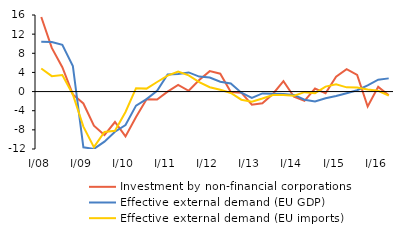
| Category | Investment by non-financial corporations | Effective external demand (EU GDP) | Effective external demand (EU imports) |
|---|---|---|---|
| I/08 | 15.593 | 10.436 | 4.821 |
| II | 9.127 | 10.375 | 3.221 |
| III | 5.095 | 9.778 | 3.471 |
| IV | -0.59 | 5.356 | -0.609 |
| I/09 | -2.487 | -11.644 | -7.319 |
| II | -7.118 | -11.985 | -11.619 |
| III | -9.088 | -10.47 | -8.432 |
| IV | -6.36 | -8.386 | -8.192 |
| I/10 | -9.364 | -6.981 | -4.273 |
| II | -5.306 | -2.934 | 0.707 |
| III | -1.6 | -1.582 | 0.617 |
| IV | -1.67 | 0.156 | 2.005 |
| I/11 | -0.008 | 3.593 | 3.322 |
| II | 1.393 | 3.693 | 4.187 |
| III | 0.171 | 4.004 | 3.377 |
| IV | 2.428 | 3.134 | 1.979 |
| I/12 | 4.275 | 2.934 | 0.905 |
| II | 3.743 | 2.049 | 0.387 |
| III | -0.083 | 1.674 | -0.3 |
| IV | -0.226 | -0.243 | -1.697 |
| I/13 | -2.735 | -1.307 | -2.101 |
| II | -2.459 | -0.38 | -1.459 |
| III | -0.502 | -0.451 | -0.705 |
| IV | 2.192 | -0.531 | -0.72 |
| I/14 | -1.078 | -0.692 | -0.861 |
| II | -1.955 | -1.703 | -0.125 |
| III | 0.628 | -2.056 | -0.331 |
| IV | -0.371 | -1.405 | 1.043 |
| I/15 | 3.098 | -0.906 | 1.515 |
| II | 4.674 | -0.333 | 0.882 |
| III | 3.483 | 0.289 | 0.862 |
| IV | -3.126 | 1.275 | 0.413 |
| I/16 | 0.982 | 2.487 | 0.174 |
| II | -0.752 | 2.758 | -0.866 |